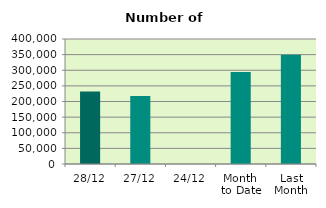
| Category | Series 0 |
|---|---|
| 28/12 | 232202 |
| 27/12 | 217658 |
| 24/12 | 0 |
| Month 
to Date | 294740.105 |
| Last
Month | 349295 |